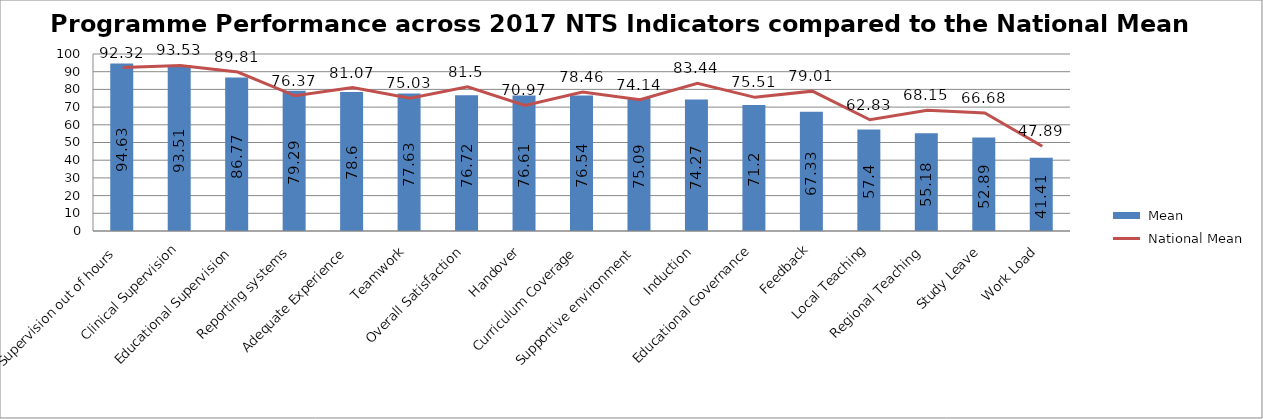
| Category |  Mean |
|---|---|
| Clinical Supervision out of hours | 94.63 |
| Clinical Supervision | 93.51 |
| Educational Supervision | 86.77 |
| Reporting systems | 79.29 |
| Adequate Experience | 78.6 |
| Teamwork | 77.63 |
| Overall Satisfaction | 76.72 |
| Handover | 76.61 |
| Curriculum Coverage | 76.54 |
| Supportive environment | 75.09 |
| Induction | 74.27 |
| Educational Governance | 71.2 |
| Feedback | 67.33 |
| Local Teaching | 57.4 |
| Regional Teaching | 55.18 |
| Study Leave | 52.89 |
| Work Load | 41.41 |